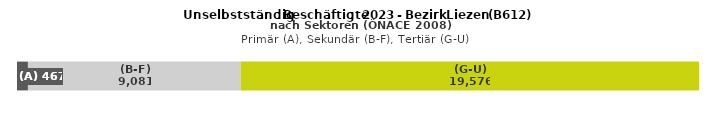
| Category | (A) | (B-F) | (G-U) |
|---|---|---|---|
| 0 | 467 | 9081 | 19576 |